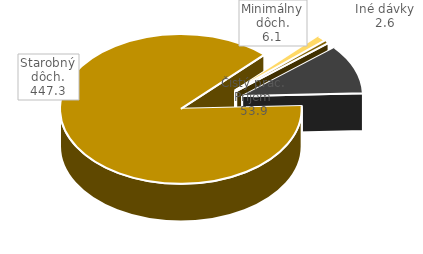
| Category | Series 0 |
|---|---|
| Iné dávky | 2.637 |
| Čistý prac. Príjem | 53.894 |
| Starobný dôch. | 447.305 |
| Minimálny dôch. | 6.05 |